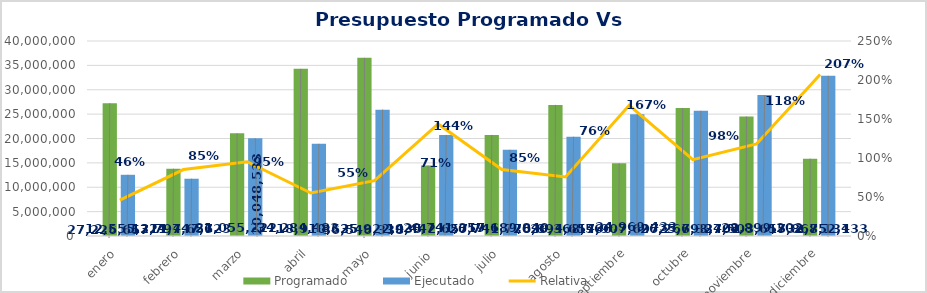
| Category | Programado | Ejecutado |
|---|---|---|
| enero | 27226656.67 | 12555224.24 |
| febrero | 13794656.67 | 11747622.83 |
| marzo | 21055222 | 20048533.17 |
| abril | 34284483 | 18910535.17 |
| mayo | 36546338 | 25922935.07 |
| junio  | 14442657 | 20741358.7 |
| julio | 20741769.67 | 17689848.61 |
| agosto | 26894656.67 | 20368565.85 |
| septiembre | 14907696.67 | 24969432.97 |
| octubre | 26267336.67 | 25693700.91 |
| noviembre | 24503656.67 | 28899202.37 |
| diciembre | 15867134.34 | 32852132.99 |